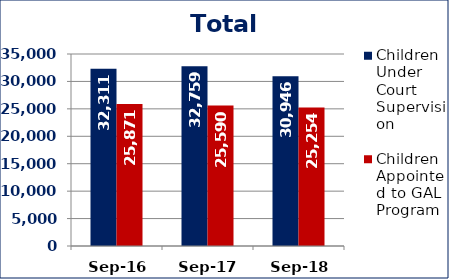
| Category | Children Under Court Supervision  | Children Appointed to GAL Program  |
|---|---|---|
| Sep-16 | 32311 | 25871 |
| Sep-17 | 32759 | 25590 |
| Sep-18 | 30946 | 25254 |